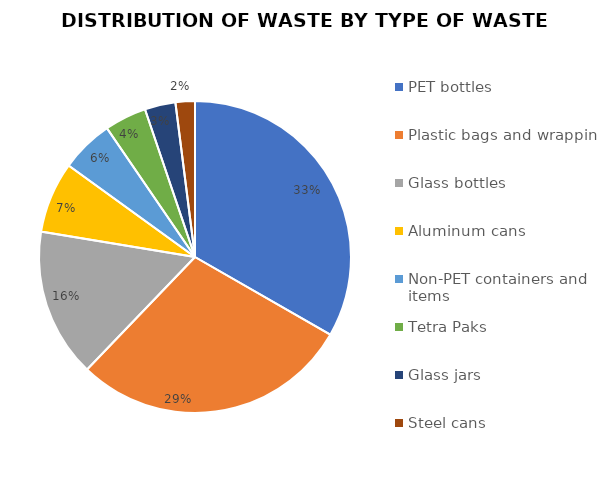
| Category | Series 0 |
|---|---|
| PET bottles | 6674 |
| Plastic bags and wrapping | 5789 |
| Glass bottles | 3095 |
| Aluminum cans | 1476 |
| Non-PET containers and items | 1099 |
| Tetra Paks | 872 |
| Glass jars | 639 |
| Steel cans | 403 |